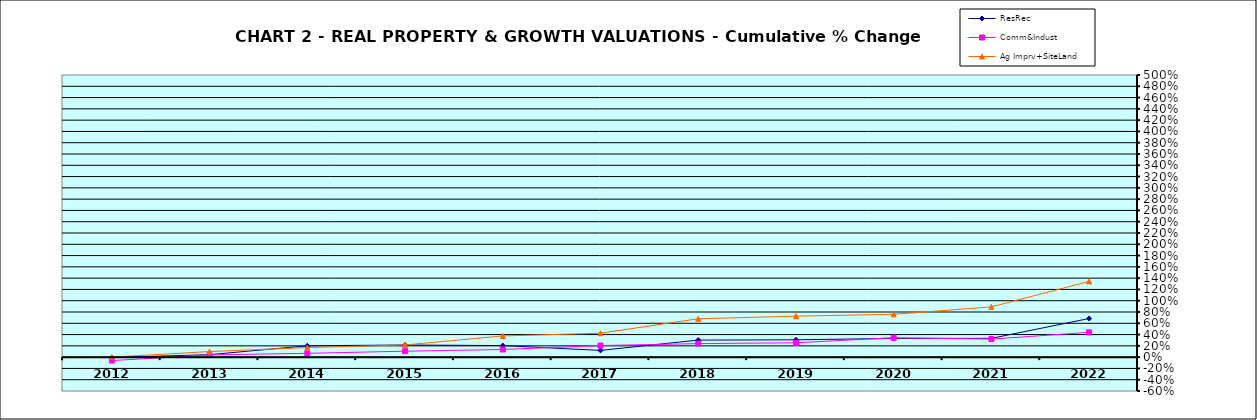
| Category | ResRec | Comm&Indust | Ag Imprv+SiteLand |
|---|---|---|---|
| 2012.0 | -0.006 | -0.061 | 0 |
| 2013.0 | 0.044 | 0.039 | 0.099 |
| 2014.0 | 0.201 | 0.068 | 0.17 |
| 2015.0 | 0.216 | 0.105 | 0.216 |
| 2016.0 | 0.205 | 0.136 | 0.376 |
| 2017.0 | 0.12 | 0.206 | 0.424 |
| 2018.0 | 0.302 | 0.24 | 0.68 |
| 2019.0 | 0.307 | 0.254 | 0.727 |
| 2020.0 | 0.332 | 0.344 | 0.759 |
| 2021.0 | 0.333 | 0.32 | 0.891 |
| 2022.0 | 0.685 | 0.44 | 1.343 |